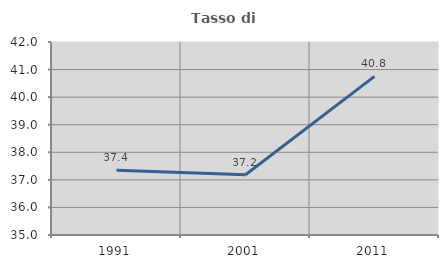
| Category | Tasso di occupazione   |
|---|---|
| 1991.0 | 37.352 |
| 2001.0 | 37.185 |
| 2011.0 | 40.755 |